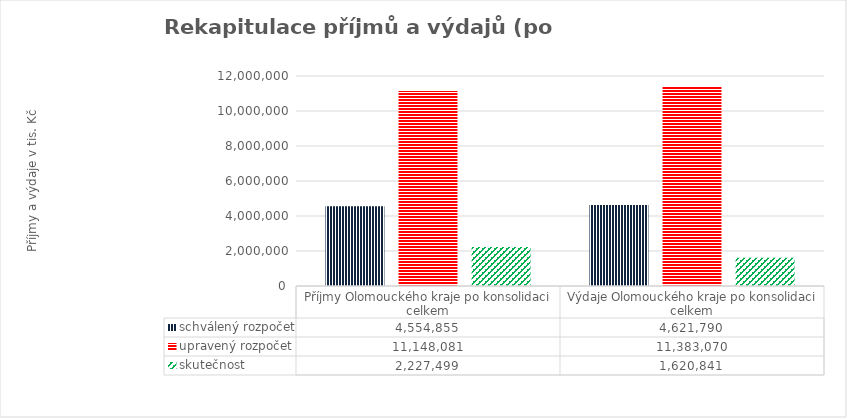
| Category | schválený rozpočet | upravený rozpočet | skutečnost |
|---|---|---|---|
| Příjmy Olomouckého kraje po konsolidaci celkem | 4554855 | 11148081 | 2227499 |
| Výdaje Olomouckého kraje po konsolidaci celkem | 4621790 | 11383070 | 1620841 |